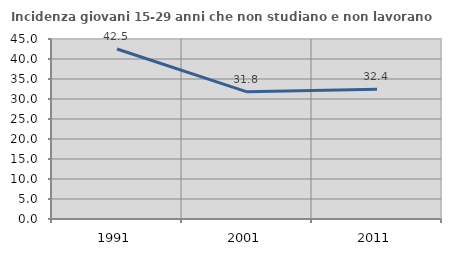
| Category | Incidenza giovani 15-29 anni che non studiano e non lavorano  |
|---|---|
| 1991.0 | 42.508 |
| 2001.0 | 31.792 |
| 2011.0 | 32.432 |